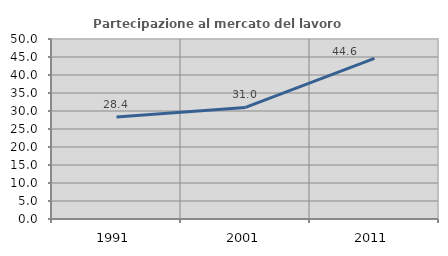
| Category | Partecipazione al mercato del lavoro  femminile |
|---|---|
| 1991.0 | 28.356 |
| 2001.0 | 31.004 |
| 2011.0 | 44.625 |